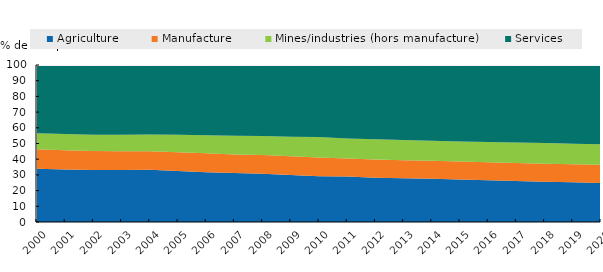
| Category | Agriculture | Manufacture | Mines/industries (hors manufacture) | Services |
|---|---|---|---|---|
| 2000.0 | 33.936 | 12.369 | 10.271 | 43.425 |
| 2001.0 | 33.442 | 12.286 | 10.369 | 43.902 |
| 2002.0 | 33.128 | 12.043 | 10.344 | 44.485 |
| 2003.0 | 33.13 | 11.864 | 10.502 | 44.505 |
| 2004.0 | 33.252 | 11.869 | 10.652 | 44.227 |
| 2005.0 | 32.449 | 11.933 | 11.116 | 44.502 |
| 2006.0 | 31.759 | 11.989 | 11.497 | 44.756 |
| 2007.0 | 31.148 | 11.92 | 11.88 | 45.051 |
| 2008.0 | 30.665 | 11.985 | 12.191 | 45.158 |
| 2009.0 | 30.008 | 11.793 | 12.539 | 45.661 |
| 2010.0 | 29.114 | 12.011 | 12.954 | 45.921 |
| 2011.0 | 28.942 | 11.492 | 12.751 | 46.815 |
| 2012.0 | 28.114 | 11.705 | 12.949 | 47.233 |
| 2013.0 | 27.787 | 11.587 | 12.865 | 47.762 |
| 2014.0 | 27.478 | 11.572 | 12.773 | 48.177 |
| 2015.0 | 26.996 | 11.485 | 12.814 | 48.704 |
| 2016.0 | 26.669 | 11.444 | 12.77 | 49.117 |
| 2017.0 | 26.099 | 11.537 | 13.012 | 49.353 |
| 2018.0 | 25.575 | 11.557 | 13.115 | 49.752 |
| 2019.0 | 25.258 | 11.537 | 13.053 | 50.152 |
| 2020.0 | 24.871 | 11.554 | 13.106 | 50.469 |